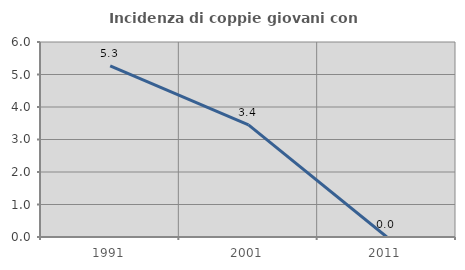
| Category | Incidenza di coppie giovani con figli |
|---|---|
| 1991.0 | 5.263 |
| 2001.0 | 3.448 |
| 2011.0 | 0 |